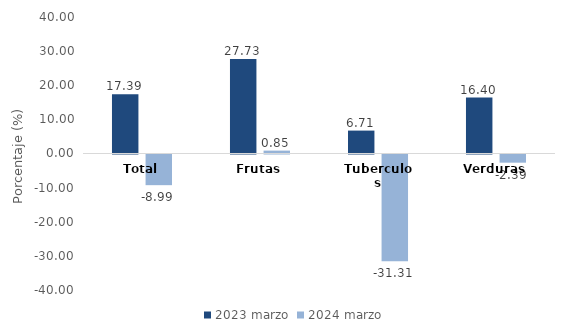
| Category | 2023 | 2024 |
|---|---|---|
| Total | 17.392 | -8.987 |
| Frutas | 27.725 | 0.846 |
| Tuberculos | 6.712 | -31.314 |
| Verduras | 16.396 | -2.394 |